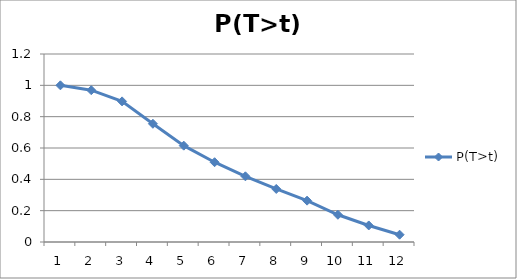
| Category | P(T>t) |
|---|---|
| 0 | 1 |
| 1 | 0.969 |
| 2 | 0.898 |
| 3 | 0.755 |
| 4 | 0.615 |
| 5 | 0.509 |
| 6 | 0.419 |
| 7 | 0.339 |
| 8 | 0.264 |
| 9 | 0.174 |
| 10 | 0.106 |
| 11 | 0.047 |